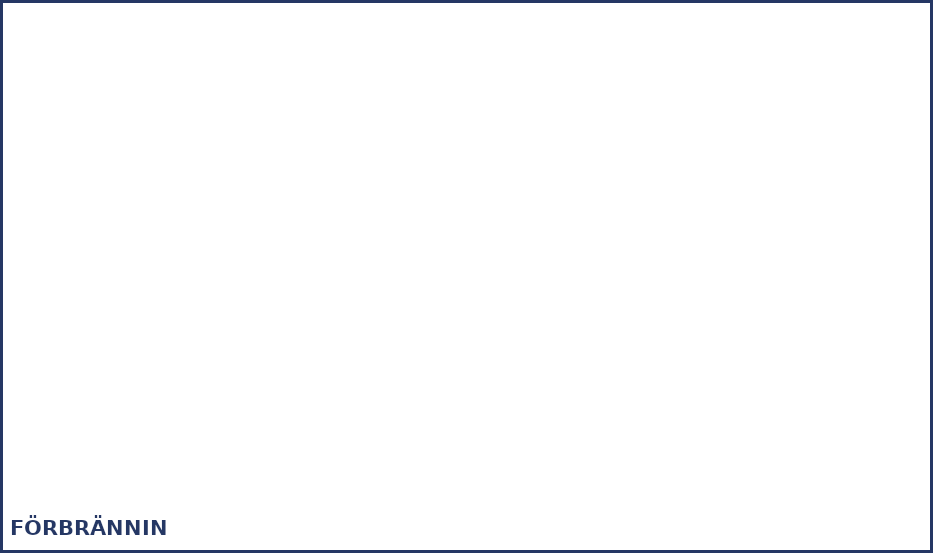
| Category | Series 0 |
|---|---|
| Brännved | 0 |
| Gasol | 0 |
| Diesel  | 0 |
| Brännolja, fotogen etc.  | 0 |